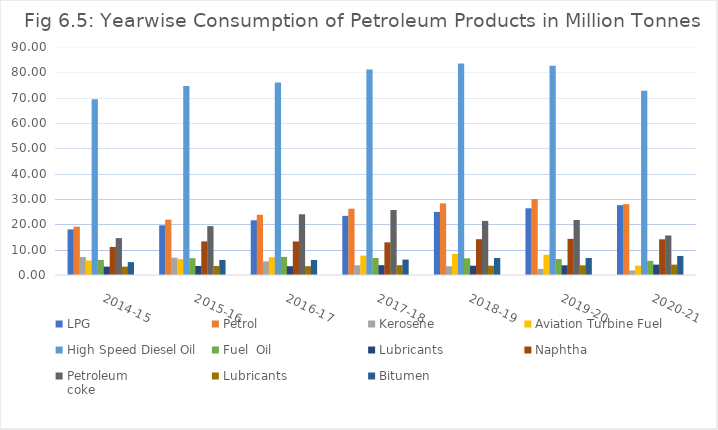
| Category | LPG | Petrol | Kerosene | Aviation Turbine Fuel | High Speed Diesel Oil | Fuel  Oil | Lubricants | Naphtha | Petroleum
coke | Bitumen |
|---|---|---|---|---|---|---|---|---|---|---|
| 2014-15 | 18 | 19.075 | 7.087 | 5.723 | 69.416 | 5.961 | 3.31 | 11.082 | 14.557 | 5.073 |
| 2015-16 | 19.623 | 21.847 | 6.826 | 6.262 | 74.647 | 6.632 | 3.571 | 13.271 | 19.297 | 5.938 |
| 2016-17 | 21.608 | 23.765 | 5.397 | 6.999 | 76.027 | 7.15 | 3.47 | 13.241 | 23.964 | 5.936 |
| 2017-18 | 23.342 | 26.174 | 3.845 | 7.635 | 81.073 | 6.721 | 3.884 | 12.889 | 25.657 | 6.086 |
| 2018-19 | 24.907 | 28.284 | 3.459 | 8.302 | 83.528 | 6.564 | 3.668 | 14.131 | 21.346 | 6.708 |
| 2019-20 | 26.33 | 29.975 | 2.397 | 7.999 | 82.602 | 6.302 | 3.833 | 14.268 | 21.708 | 6.72 |
| 2020-21  | 27.558 | 27.969 | 1.798 | 3.698 | 72.713 | 5.586 | 4.097 | 14.1 | 15.605 | 7.524 |